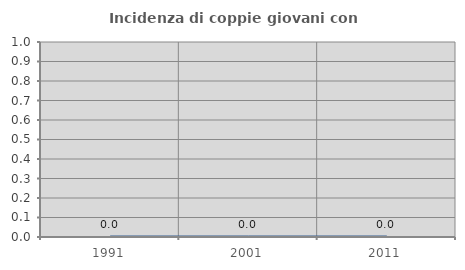
| Category | Incidenza di coppie giovani con figli |
|---|---|
| 1991.0 | 0 |
| 2001.0 | 0 |
| 2011.0 | 0 |